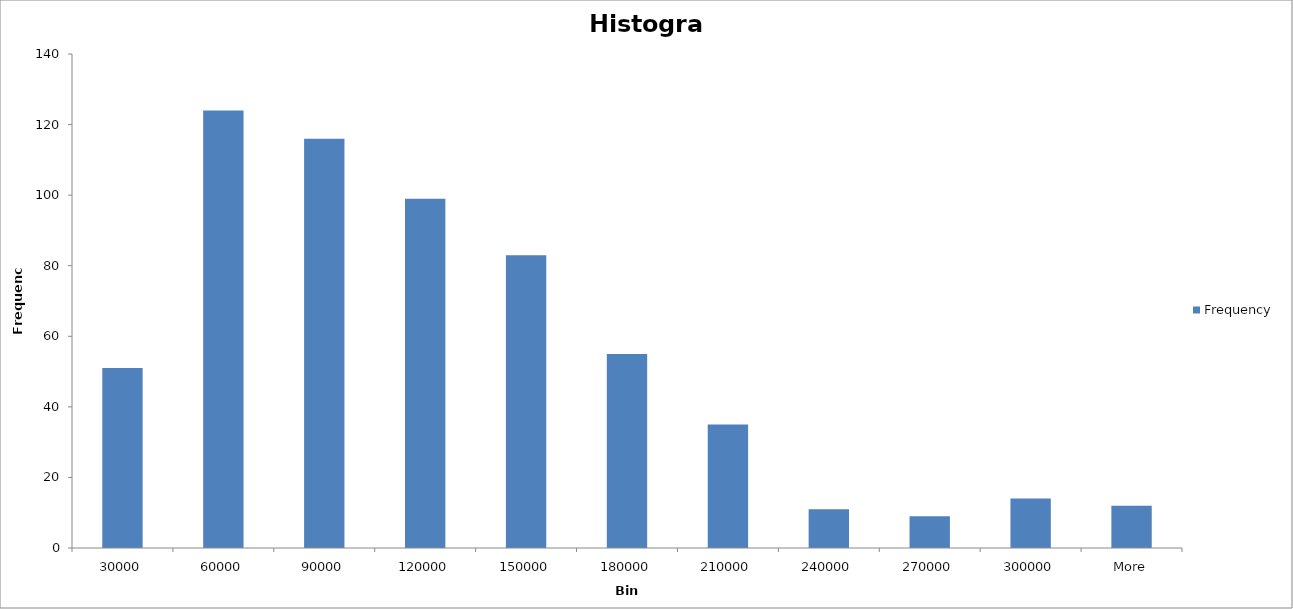
| Category | Frequency |
|---|---|
| 30000 | 51 |
| 60000 | 124 |
| 90000 | 116 |
| 120000 | 99 |
| 150000 | 83 |
| 180000 | 55 |
| 210000 | 35 |
| 240000 | 11 |
| 270000 | 9 |
| 300000 | 14 |
| More | 12 |